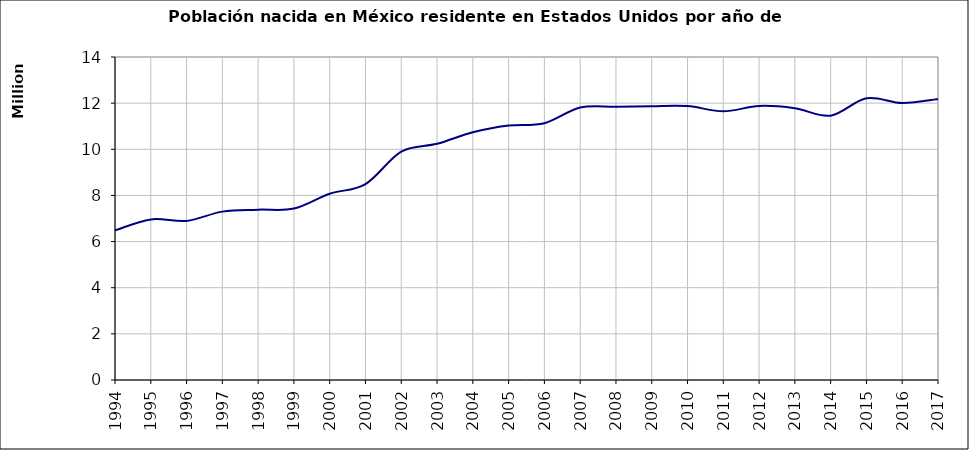
| Category | Habitantes en EU nacidos en México |
|---|---|
| 1994.0 | 6485252.69 |
| 1995.0 | 6960894.94 |
| 1996.0 | 6894787.8 |
| 1997.0 | 7298244.25 |
| 1998.0 | 7382352.3 |
| 1999.0 | 7429126.55 |
| 2000.0 | 8072288.08 |
| 2001.0 | 8494016 |
| 2002.0 | 9900414 |
| 2003.0 | 10237189 |
| 2004.0 | 10739692 |
| 2005.0 | 11026774 |
| 2006.0 | 11132120.8 |
| 2007.0 | 11811731.77 |
| 2008.0 | 11845293.67 |
| 2009.0 | 11869486.75 |
| 2010.0 | 11872688.85 |
| 2011.0 | 11644423 |
| 2012.0 | 11877703 |
| 2013.0 | 11778922 |
| 2014.0 | 11458134 |
| 2015.0 | 12211129 |
| 2016.0 | 12006942 |
| 2017.0 | 12181388 |